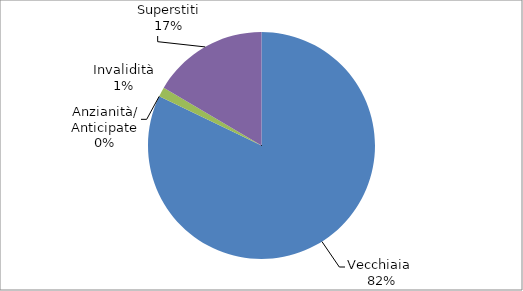
| Category | Series 0 |
|---|---|
| Vecchiaia  | 23055 |
| Anzianità/ Anticipate | 0 |
| Invalidità | 382 |
| Superstiti | 4635 |